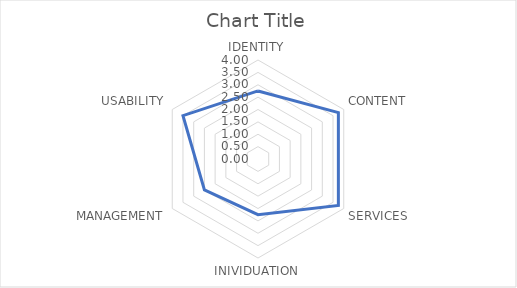
| Category | Series 0 |
|---|---|
| IDENTITY | 2.75 |
| CONTENT | 3.75 |
| SERVICES | 3.75 |
| INIVIDUATION | 2.25 |
| MANAGEMENT | 2.5 |
| USABILITY | 3.5 |